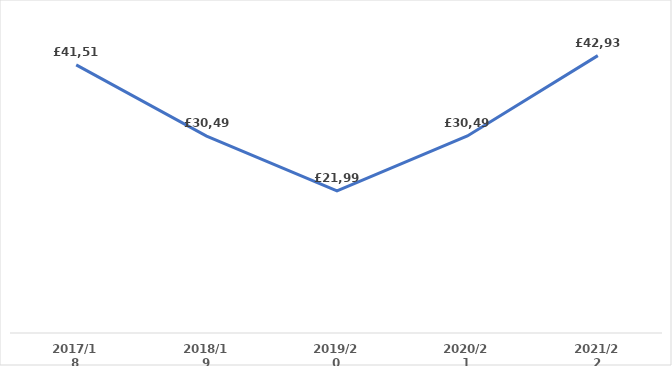
| Category | Series 0 |
|---|---|
| 2017/18 | 41513.81 |
| 2018/19 | 30490.98 |
| 2019/20 | 21991.647 |
| 2020/21 | 30498.462 |
| 2021/22 | 42938.109 |